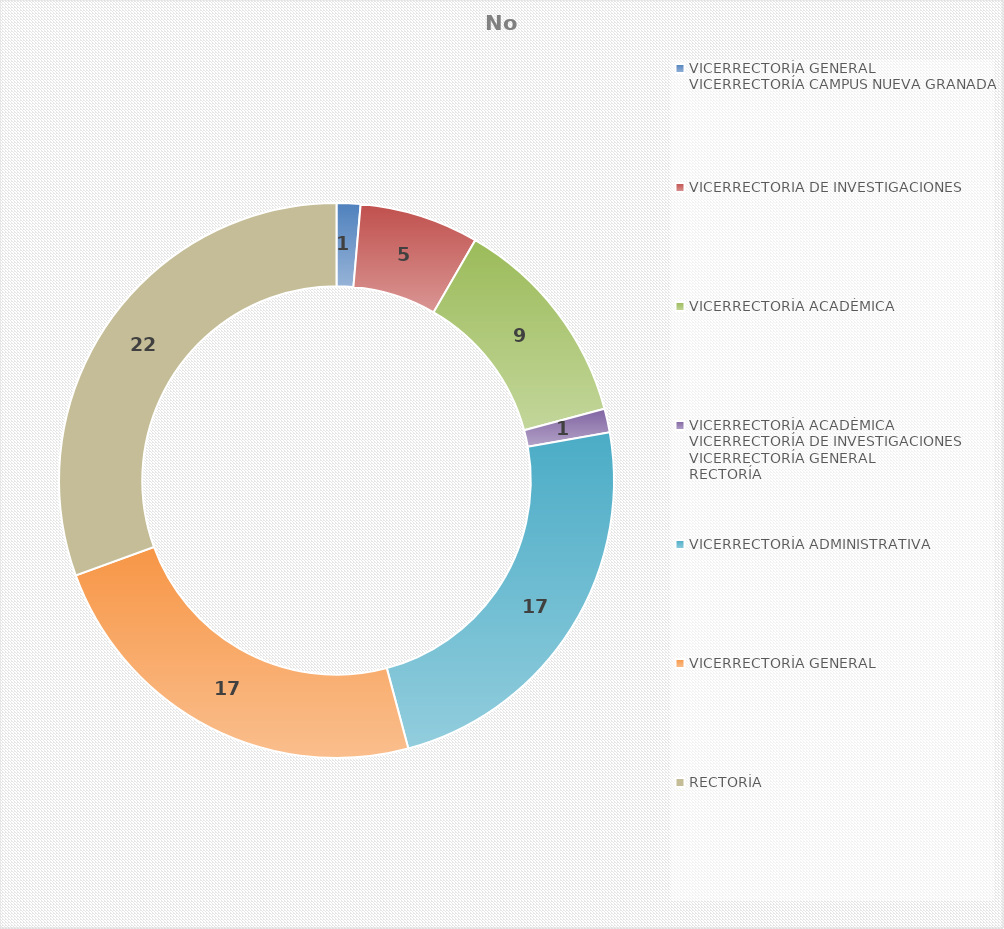
| Category | No Riesgos |
|---|---|
| VICERRECTORÍA GENERAL
VICERRECTORÍA CAMPUS NUEVA GRANADA | 1 |
| VICERRECTORIA DE INVESTIGACIONES | 5 |
| VICERRECTORÍA ACADÉMICA | 9 |
| VICERRECTORÍA ACADÉMICA
VICERRECTORÍA DE INVESTIGACIONES
VICERRECTORÍA GENERAL
RECTORÍA


 | 1 |
| VICERRECTORÍA ADMINISTRATIVA | 17 |
| VICERRECTORÍA GENERAL | 17 |
| RECTORÍA | 22 |